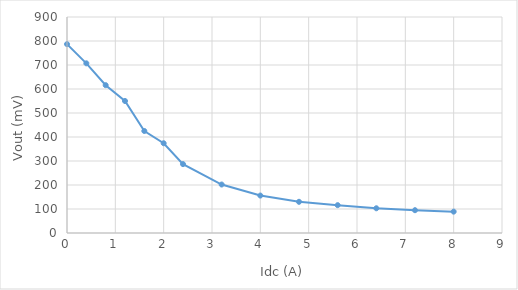
| Category | Vout (mV) |
|---|---|
| 0.0 | 787 |
| 0.4 | 707 |
| 0.8 | 616 |
| 1.2 | 550 |
| 1.6 | 425 |
| 2.0 | 374 |
| 2.4 | 287 |
| 3.2 | 202 |
| 4.0 | 156 |
| 4.8 | 130 |
| 5.6 | 116 |
| 6.4 | 103 |
| 7.2 | 95 |
| 8.0 | 89 |